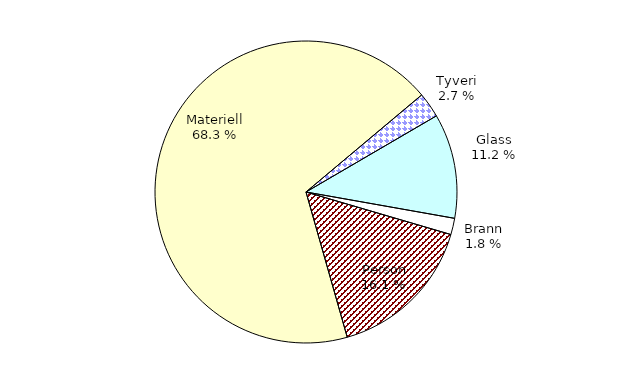
| Category | Series 0 |
|---|---|
| Tyveri | 339.819 |
| Glass | 1409.488 |
| Brann | 220.266 |
| Person | 2019.43 |
| Materiell | 8591.542 |